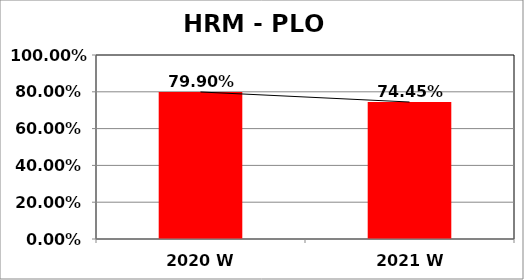
| Category | Series 0 |
|---|---|
| 2020 W | 0.799 |
| 2021 W | 0.744 |